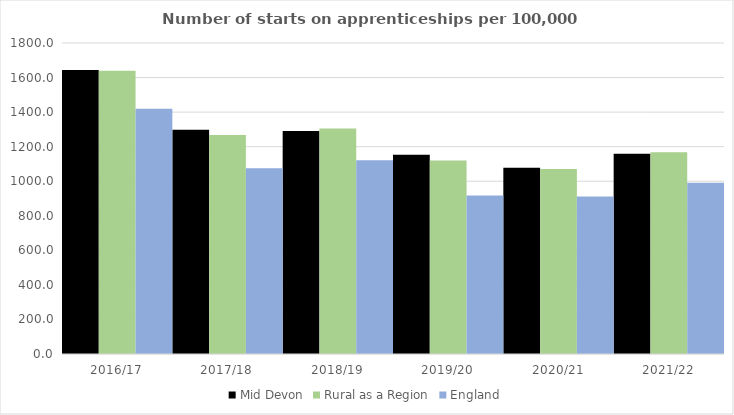
| Category | Mid Devon | Rural as a Region | England |
|---|---|---|---|
| 2016/17 | 1644 | 1638.789 | 1420 |
| 2017/18 | 1298 | 1267.474 | 1075 |
| 2018/19 | 1290 | 1304.57 | 1122 |
| 2019/20 | 1153 | 1119.662 | 918 |
| 2020/21 | 1078 | 1070.748 | 912 |
| 2021/22 | 1159 | 1167.68 | 991 |